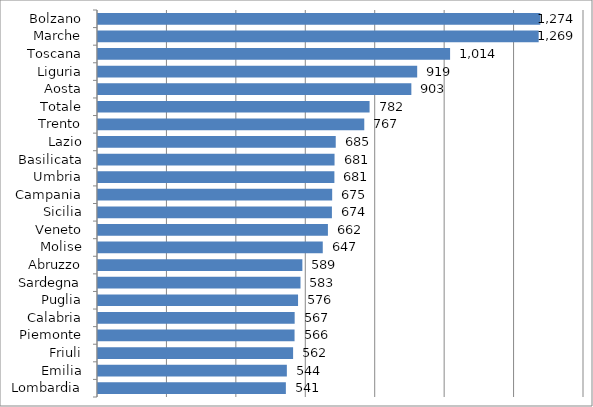
| Category | Series 0 |
|---|---|
| Bolzano | 1274.181 |
| Marche | 1269.415 |
| Toscana | 1014.257 |
| Liguria | 919.48 |
| Aosta | 902.664 |
| Totale | 782.344 |
| Trento | 767.051 |
| Lazio | 684.84 |
| Basilicata | 681.402 |
| Umbria | 680.973 |
| Campania | 674.585 |
| Sicilia | 673.837 |
| Veneto | 662.308 |
| Molise | 647.469 |
| Abruzzo | 588.709 |
| Sardegna | 583.333 |
| Puglia | 576.28 |
| Calabria | 566.521 |
| Piemonte | 566.217 |
| Friuli | 562.03 |
| Emilia | 544.025 |
| Lombardia | 541.174 |